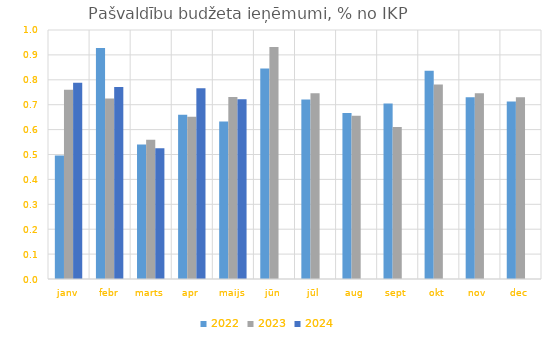
| Category | 2022 | 2023 | 2024 |
|---|---|---|---|
| janv | 0.496 | 0.76 | 0.788 |
| febr | 0.928 | 0.724 | 0.772 |
| marts | 0.54 | 0.559 | 0.525 |
| apr | 0.66 | 0.651 | 0.766 |
| maijs | 0.633 | 0.731 | 0.722 |
| jūn | 0.845 | 0.932 | 0 |
| jūl | 0.721 | 0.746 | 0 |
| aug | 0.666 | 0.655 | 0 |
| sept | 0.705 | 0.61 | 0 |
| okt | 0.837 | 0.781 | 0 |
| nov | 0.73 | 0.746 | 0 |
| dec | 0.713 | 0.73 | 0 |